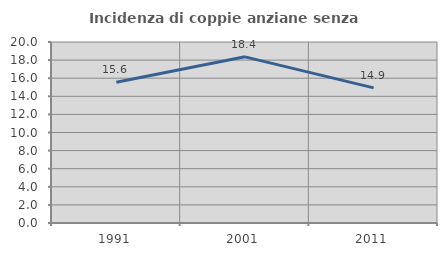
| Category | Incidenza di coppie anziane senza figli  |
|---|---|
| 1991.0 | 15.56 |
| 2001.0 | 18.36 |
| 2011.0 | 14.933 |